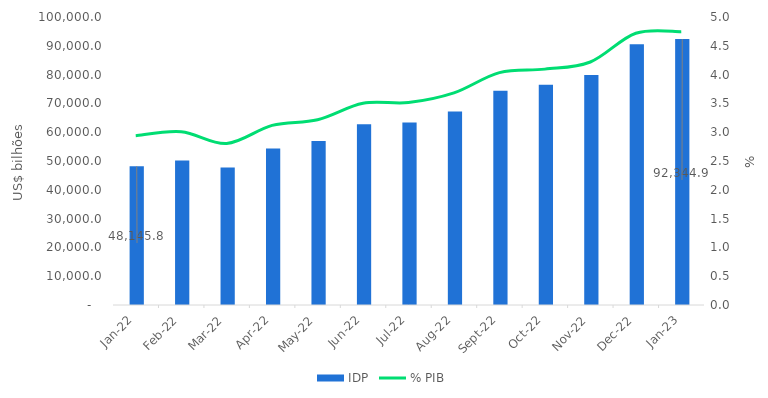
| Category | IDP |
|---|---|
| 2022-01-01 | 48145.8 |
| 2022-02-01 | 50201.3 |
| 2022-03-01 | 47711.5 |
| 2022-04-01 | 54313.5 |
| 2022-05-01 | 56979.1 |
| 2022-06-01 | 62732.9 |
| 2022-07-01 | 63384.5 |
| 2022-08-01 | 67208.2 |
| 2022-09-01 | 74349.9 |
| 2022-10-01 | 76516 |
| 2022-11-01 | 79823.1 |
| 2022-12-01 | 90572.5 |
| 2023-01-01 | 92344.9 |